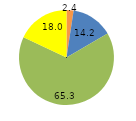
| Category | Series 0 |
|---|---|
| 0 | 2.4 |
| 1 | 14.2 |
| 2 | 65.3 |
| 3 | 18 |